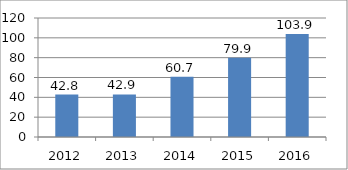
| Category | Series 0 |
|---|---|
| 2012.0 | 42.8 |
| 2013.0 | 42.9 |
| 2014.0 | 60.7 |
| 2015.0 | 79.9 |
| 2016.0 | 103.9 |